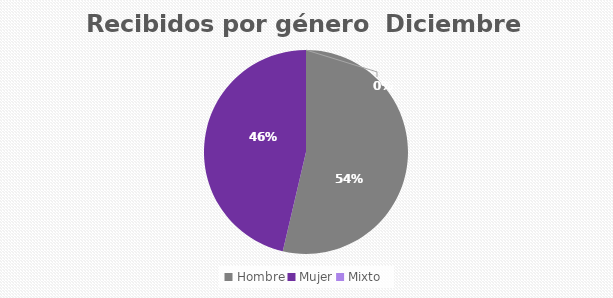
| Category | Recibidos por género  DICIEMBRE |
|---|---|
| Hombre | 22 |
| Mujer | 19 |
| Mixto | 0 |